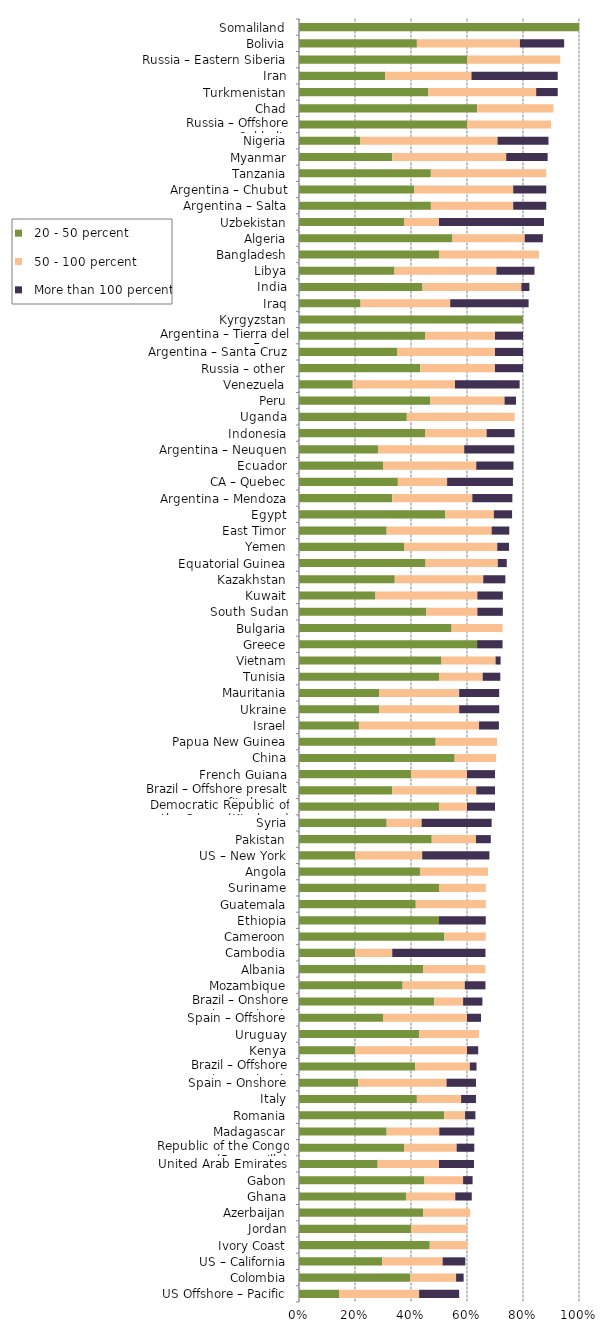
| Category |   20 - 50 percent |   50 - 100 percent |   More than 100 percent | Series 3 |
|---|---|---|---|---|
| US Offshore – Pacific | 0.143 | 0.286 | 0.143 |  |
| Colombia | 0.397 | 0.164 | 0.027 |  |
| US – California | 0.297 | 0.216 | 0.081 |  |
| Ivory Coast | 0.467 | 0.133 | 0 |  |
| Jordan | 0.4 | 0.2 | 0 |  |
| Azerbaijan | 0.444 | 0.167 | 0 |  |
| Ghana | 0.382 | 0.176 | 0.059 |  |
| Gabon | 0.448 | 0.138 | 0.034 |  |
| United Arab Emirates | 0.281 | 0.219 | 0.125 |  |
| Republic of the Congo (Brazzaville) | 0.375 | 0.188 | 0.063 |  |
| Madagascar | 0.313 | 0.188 | 0.125 |  |
| Romania | 0.519 | 0.074 | 0.037 |  |
| Italy | 0.421 | 0.158 | 0.053 |  |
| Spain – Onshore | 0.211 | 0.316 | 0.105 |  |
| Brazil – Offshore concession contracts | 0.415 | 0.195 | 0.024 |  |
| Kenya | 0.2 | 0.4 | 0.04 |  |
| Uruguay | 0.429 | 0.214 | 0 |  |
| Spain – Offshore | 0.3 | 0.3 | 0.05 |  |
| Brazil – Onshore concession contracts | 0.483 | 0.103 | 0.069 |  |
| Mozambique | 0.37 | 0.222 | 0.074 |  |
| Albania | 0.444 | 0.222 | 0 |  |
| Cambodia | 0.2 | 0.133 | 0.333 |  |
| Cameroon | 0.519 | 0.148 | 0 |  |
| Ethiopia | 0.5 | 0 | 0.167 |  |
| Guatemala | 0.417 | 0.25 | 0 |  |
| Suriname | 0.5 | 0.167 | 0 |  |
| Angola | 0.432 | 0.243 | 0 |  |
| US – New York | 0.2 | 0.24 | 0.24 |  |
| Pakistan | 0.474 | 0.158 | 0.053 |  |
| Syria | 0.313 | 0.125 | 0.25 |  |
| Democratic Republic of the Congo (Kinshasa) | 0.5 | 0.1 | 0.1 |  |
| Brazil – Offshore presalt area profit sharing contracts | 0.333 | 0.3 | 0.067 |  |
| French Guiana | 0.4 | 0.2 | 0.1 |  |
| China | 0.556 | 0.148 | 0 |  |
| Papua New Guinea | 0.488 | 0.22 | 0 |  |
| Israel | 0.214 | 0.429 | 0.071 |  |
| Ukraine | 0.286 | 0.286 | 0.143 |  |
| Mauritania | 0.286 | 0.286 | 0.143 |  |
| Tunisia | 0.5 | 0.156 | 0.063 |  |
| Vietnam | 0.509 | 0.193 | 0.018 |  |
| Greece | 0.636 | 0 | 0.091 |  |
| Bulgaria | 0.545 | 0.182 | 0 |  |
| South Sudan | 0.455 | 0.182 | 0.091 |  |
| Kuwait | 0.273 | 0.364 | 0.091 |  |
| Kazakhstan | 0.342 | 0.316 | 0.079 |  |
| Equatorial Guinea | 0.452 | 0.258 | 0.032 |  |
| Yemen | 0.375 | 0.333 | 0.042 |  |
| East Timor | 0.313 | 0.375 | 0.063 |  |
| Egypt | 0.522 | 0.174 | 0.065 |  |
| Argentina – Mendoza | 0.333 | 0.286 | 0.143 |  |
| CA – Quebec | 0.353 | 0.176 | 0.235 |  |
| Ecuador | 0.3 | 0.333 | 0.133 |  |
| Argentina – Neuquen | 0.282 | 0.308 | 0.179 |  |
| Indonesia | 0.45 | 0.22 | 0.1 |  |
| Uganda | 0.385 | 0.385 | 0 |  |
| Peru | 0.469 | 0.265 | 0.041 |  |
| Venezuela | 0.192 | 0.365 | 0.231 |  |
| Russia – other | 0.433 | 0.267 | 0.1 |  |
| Argentina – Santa Cruz | 0.35 | 0.35 | 0.1 |  |
| Argentina – Tierra del Fuego | 0.45 | 0.25 | 0.1 |  |
| Kyrgyzstan | 0.8 | 0 | 0 |  |
| Iraq | 0.22 | 0.32 | 0.28 |  |
| India | 0.441 | 0.353 | 0.029 |  |
| Libya | 0.341 | 0.364 | 0.136 |  |
| Bangladesh | 0.5 | 0.357 | 0 |  |
| Algeria | 0.548 | 0.258 | 0.065 |  |
| Uzbekistan | 0.375 | 0.125 | 0.375 |  |
| Argentina – Salta | 0.471 | 0.294 | 0.118 |  |
| Argentina – Chubut | 0.412 | 0.353 | 0.118 |  |
| Tanzania | 0.471 | 0.412 | 0 |  |
| Myanmar | 0.333 | 0.407 | 0.148 |  |
| Nigeria | 0.218 | 0.491 | 0.182 |  |
| Russia – Offshore Sakhalin | 0.6 | 0.3 | 0 |  |
| Chad | 0.636 | 0.273 | 0 |  |
| Turkmenistan | 0.462 | 0.385 | 0.077 |  |
| Iran | 0.308 | 0.308 | 0.308 |  |
| Russia – Eastern Siberia | 0.6 | 0.333 | 0 |  |
| Bolivia | 0.421 | 0.368 | 0.158 |  |
| Somaliland | 1 | 0 | 0 |  |